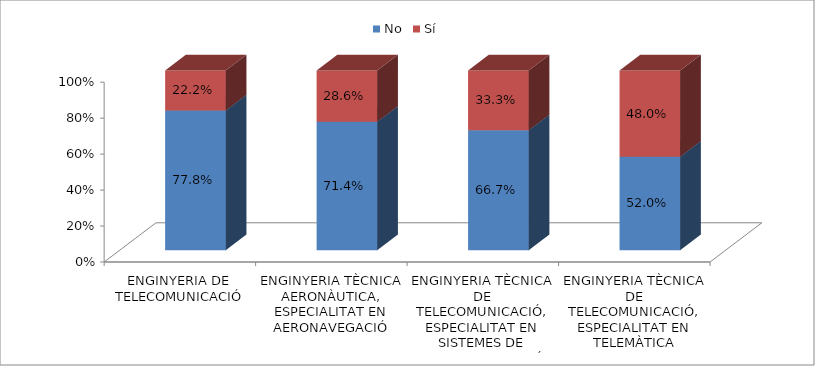
| Category | No | Sí |
|---|---|---|
| ENGINYERIA DE TELECOMUNICACIÓ | 0.778 | 0.222 |
| ENGINYERIA TÈCNICA AERONÀUTICA, ESPECIALITAT EN AERONAVEGACIÓ | 0.714 | 0.286 |
| ENGINYERIA TÈCNICA DE TELECOMUNICACIÓ, ESPECIALITAT EN SISTEMES DE TELECOMUNICACIÓ | 0.667 | 0.333 |
| ENGINYERIA TÈCNICA DE TELECOMUNICACIÓ, ESPECIALITAT EN TELEMÀTICA | 0.52 | 0.48 |